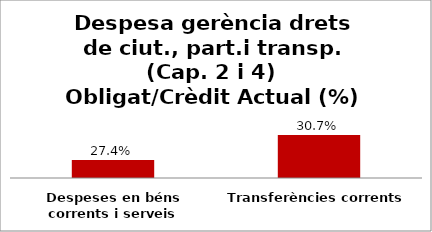
| Category | Series 0 |
|---|---|
| Despeses en béns corrents i serveis | 0.274 |
| Transferències corrents | 0.307 |